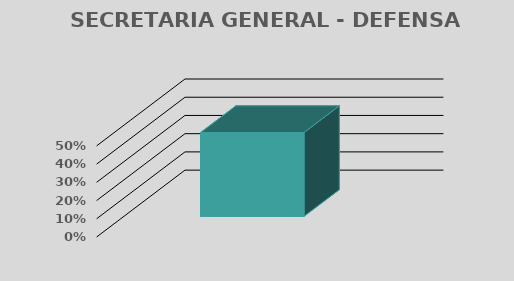
| Category | DEFENSA JURIDICA |
|---|---|
| 0 | 0.46 |